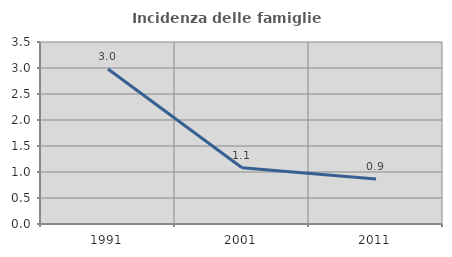
| Category | Incidenza delle famiglie numerose |
|---|---|
| 1991.0 | 2.979 |
| 2001.0 | 1.08 |
| 2011.0 | 0.865 |